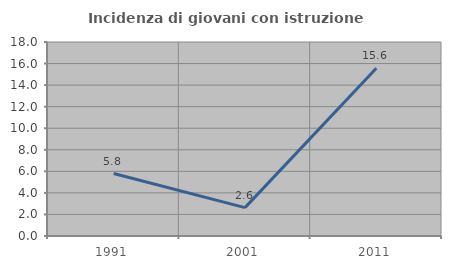
| Category | Incidenza di giovani con istruzione universitaria |
|---|---|
| 1991.0 | 5.797 |
| 2001.0 | 2.632 |
| 2011.0 | 15.556 |